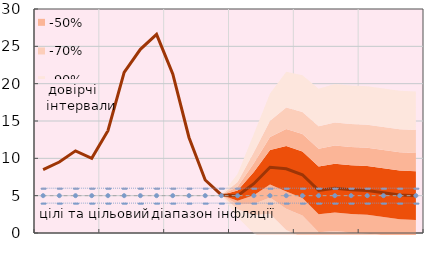
| Category | Series 8 | Series 10 | Series 11 | Series 12 |
|---|---|---|---|---|
|  | 8.5 | 4 | 5 | 6 |
|  | 9.5 | 4 | 5 | 6 |
|  | 11 | 4 | 5 | 6 |
| IV.21 | 10 | 4 | 5 | 6 |
|  | 13.7 | 4 | 5 | 6 |
|  | 21.5 | 4 | 5 | 6 |
|  | 24.6 | 4 | 5 | 6 |
| IV.22 | 26.6 | 4 | 5 | 6 |
|  | 21.3 | 4 | 5 | 6 |
|  | 12.8 | 4 | 5 | 6 |
|  | 7.1 | 4 | 5 | 6 |
| IV.23 | 5.1 | 4 | 5 | 6 |
|  | 5 | 4 | 5 | 6 |
|  | 6.6 | 4 | 5 | 6 |
|  | 8.8 | 4 | 5 | 6 |
| IV.24 | 8.6 | 4 | 5 | 6 |
|  | 7.8 | 4 | 5 | 6 |
|  | 5.7 | 4 | 5 | 6 |
|  | 6 | 4 | 5 | 6 |
| IV.25 | 5.8 | 4 | 5 | 6 |
|  | 5.7 | 4 | 5 | 6 |
|  | 5.4 | 4 | 5 | 6 |
|  | 5.1 | 4 | 5 | 6 |
| IV.26 | 5 | 4 | 5 | 6 |